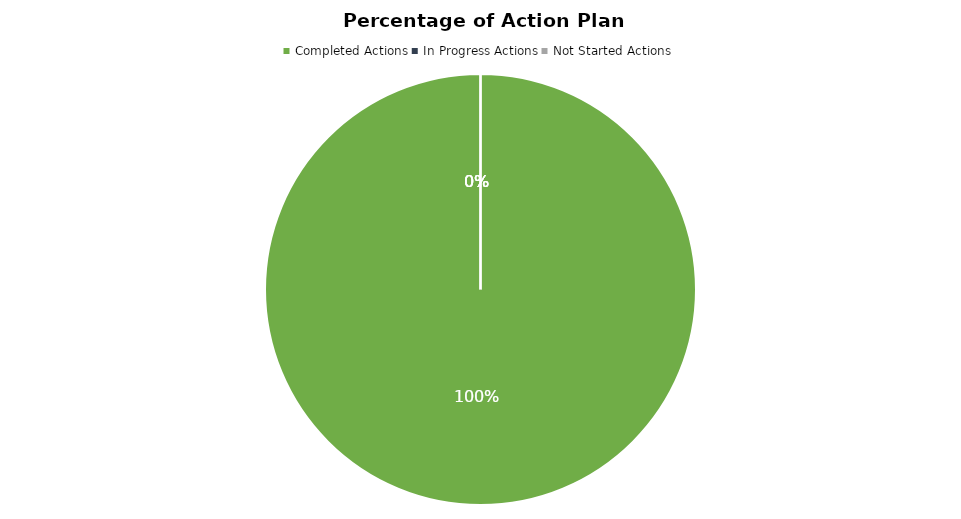
| Category | % Complete |
|---|---|
| 0 | 1 |
| 1 | 0 |
| 2 | 0 |